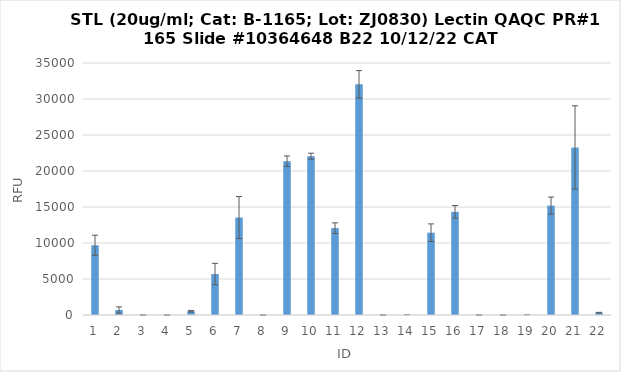
| Category | RFU |
|---|---|
| 0 | 9687.25 |
| 1 | 687.25 |
| 2 | 10.5 |
| 3 | 3.5 |
| 4 | 527.5 |
| 5 | 5688.5 |
| 6 | 13537.75 |
| 7 | 1 |
| 8 | 21359 |
| 9 | 22054 |
| 10 | 12066 |
| 11 | 32034 |
| 12 | 7.5 |
| 13 | 2.5 |
| 14 | 11431.75 |
| 15 | 14330.25 |
| 16 | 7.5 |
| 17 | 2 |
| 18 | 2 |
| 19 | 15190.75 |
| 20 | 23273.25 |
| 21 | 325.75 |